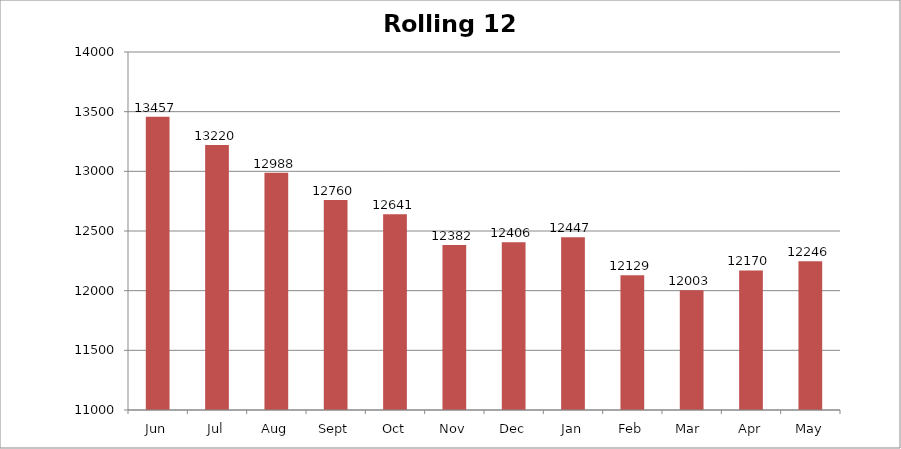
| Category | Rolling 12 Month |
|---|---|
| Jun | 13457 |
| Jul | 13220 |
| Aug | 12988 |
| Sept | 12760 |
| Oct | 12641 |
| Nov | 12382 |
| Dec | 12406 |
| Jan | 12447 |
| Feb | 12129 |
| Mar  | 12003 |
| Apr | 12170 |
| May | 12246 |